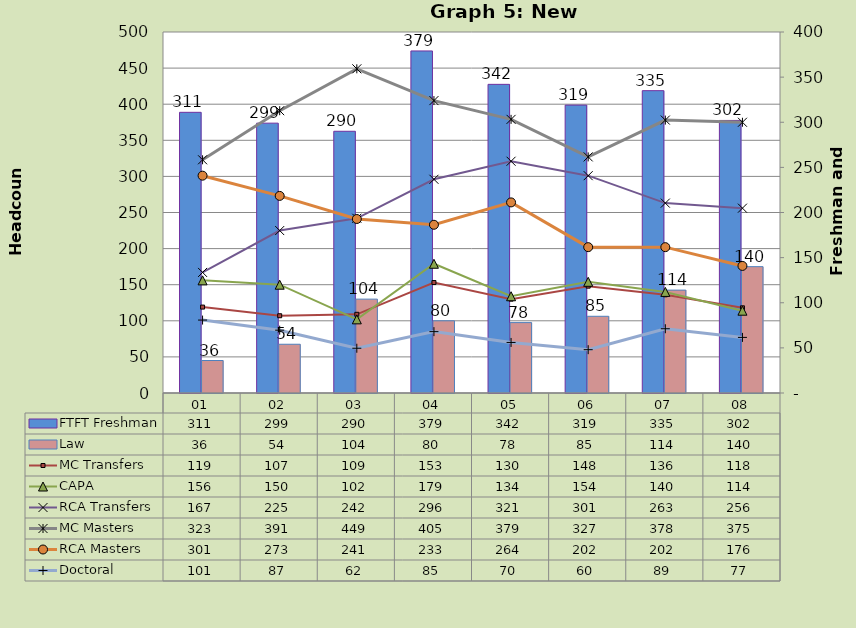
| Category | FTFT Freshman | Law |
|---|---|---|
| 01 | 311 | 36 |
| 02 | 299 | 54 |
| 03 | 290 | 104 |
| 04 | 379 | 80 |
| 05 | 342 | 78 |
| 06 | 319 | 85 |
| 07 | 335 | 114 |
| 08 | 302 | 140 |